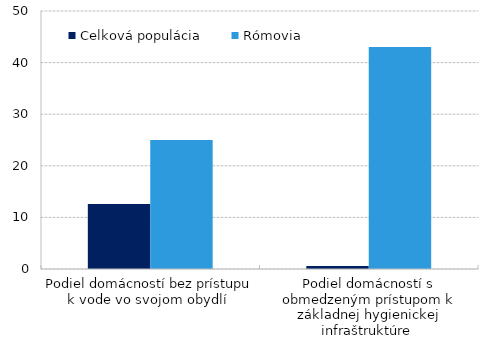
| Category | Celková populácia | Rómovia |
|---|---|---|
| Podiel domácností bez prístupu k vode vo svojom obydlí  | 12.6 | 25 |
| Podiel domácností s obmedzeným prístupom k základnej hygienickej infraštruktúre  | 0.6 | 43 |